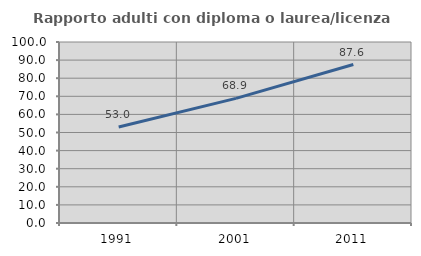
| Category | Rapporto adulti con diploma o laurea/licenza media  |
|---|---|
| 1991.0 | 53.016 |
| 2001.0 | 68.856 |
| 2011.0 | 87.56 |